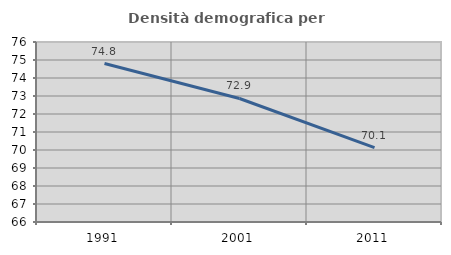
| Category | Densità demografica |
|---|---|
| 1991.0 | 74.805 |
| 2001.0 | 72.862 |
| 2011.0 | 70.13 |